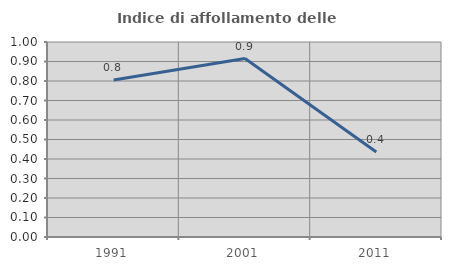
| Category | Indice di affollamento delle abitazioni  |
|---|---|
| 1991.0 | 0.806 |
| 2001.0 | 0.915 |
| 2011.0 | 0.435 |